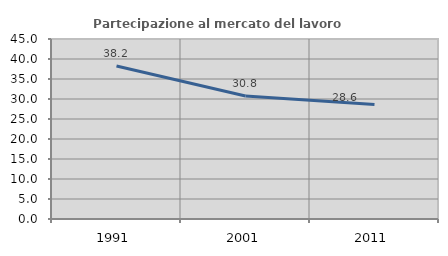
| Category | Partecipazione al mercato del lavoro  femminile |
|---|---|
| 1991.0 | 38.247 |
| 2001.0 | 30.769 |
| 2011.0 | 28.649 |